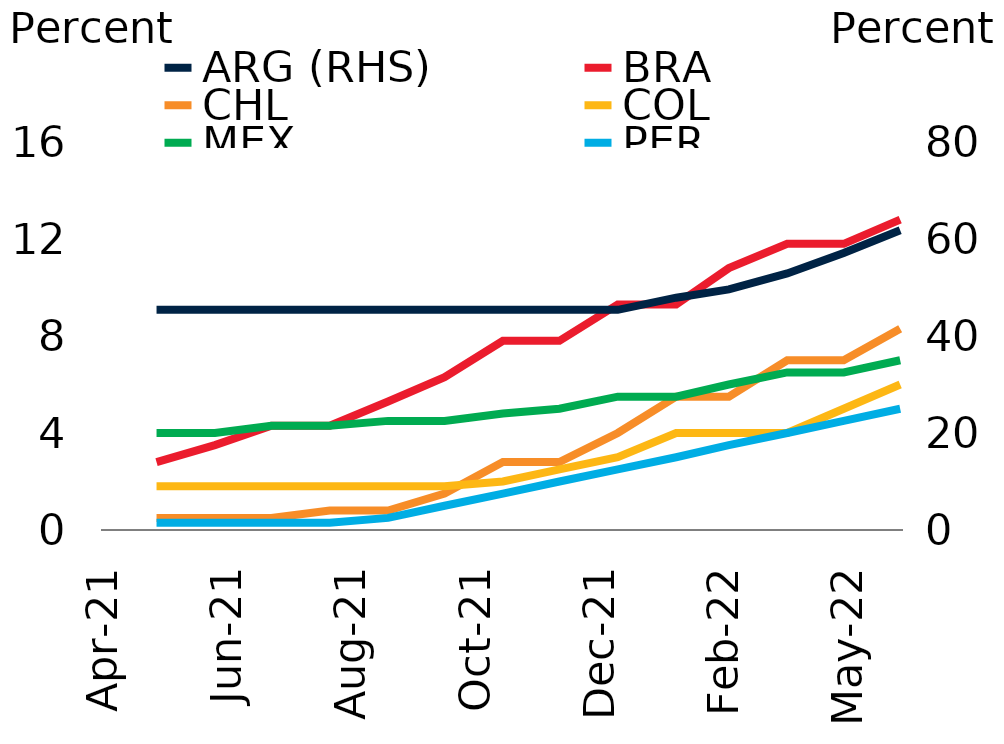
| Category | ARG (RHS) | BRA | CHL | COL | MEX | PER |
|---|---|---|---|---|---|---|
| 2021-04-30 |  | 2.8 | 0.5 | 1.8 | 4 | 0.3 |
| 2021-05-31 |  | 3.5 | 0.5 | 1.8 | 4 | 0.3 |
| 2021-06-30 |  | 4.3 | 0.5 | 1.8 | 4.3 | 0.3 |
| 2021-07-31 |  | 4.3 | 0.8 | 1.8 | 4.3 | 0.3 |
| 2021-08-31 |  | 5.3 | 0.8 | 1.8 | 4.5 | 0.5 |
| 2021-09-30 |  | 6.3 | 1.5 | 1.8 | 4.5 | 1 |
| 2021-10-31 |  | 7.8 | 2.8 | 2 | 4.8 | 1.5 |
| 2021-11-30 |  | 7.8 | 2.8 | 2.5 | 5 | 2 |
| 2021-12-31 |  | 9.3 | 4 | 3 | 5.5 | 2.5 |
| 2022-01-31 |  | 9.3 | 5.5 | 4 | 5.5 | 3 |
| 2022-02-28 |  | 10.8 | 5.5 | 4 | 6 | 3.5 |
| 2022-03-31 |  | 11.8 | 7 | 4 | 6.5 | 4 |
| 2022-04-30 |  | 11.8 | 7 | 5 | 6.5 | 4.5 |
| 2022-05-30 |  | 12.8 | 8.3 | 6 | 7 | 5 |